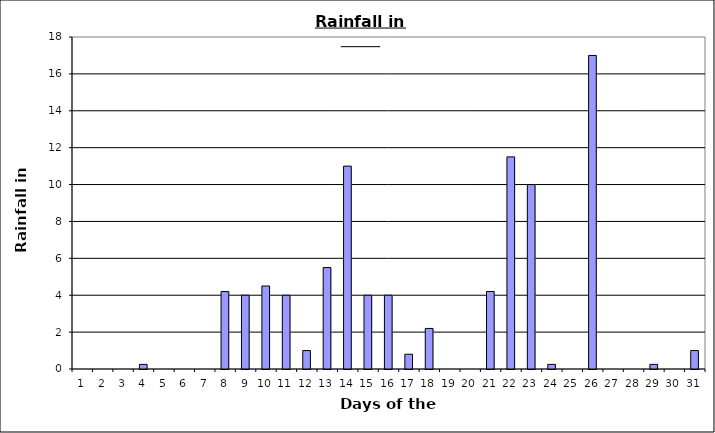
| Category | Series 0 |
|---|---|
| 0 | 0 |
| 1 | 0 |
| 2 | 0 |
| 3 | 0.25 |
| 4 | 0 |
| 5 | 0 |
| 6 | 0 |
| 7 | 4.2 |
| 8 | 4 |
| 9 | 4.5 |
| 10 | 4 |
| 11 | 1 |
| 12 | 5.5 |
| 13 | 11 |
| 14 | 4 |
| 15 | 4 |
| 16 | 0.8 |
| 17 | 2.2 |
| 18 | 0 |
| 19 | 0 |
| 20 | 4.2 |
| 21 | 11.5 |
| 22 | 10 |
| 23 | 0.25 |
| 24 | 0 |
| 25 | 17 |
| 26 | 0 |
| 27 | 0 |
| 28 | 0.25 |
| 29 | 0 |
| 30 | 1 |